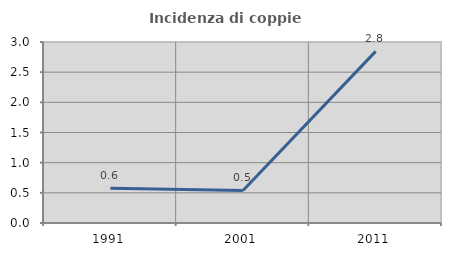
| Category | Incidenza di coppie miste |
|---|---|
| 1991.0 | 0.577 |
| 2001.0 | 0.539 |
| 2011.0 | 2.845 |